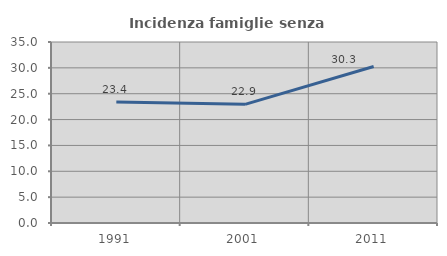
| Category | Incidenza famiglie senza nuclei |
|---|---|
| 1991.0 | 23.404 |
| 2001.0 | 22.944 |
| 2011.0 | 30.259 |